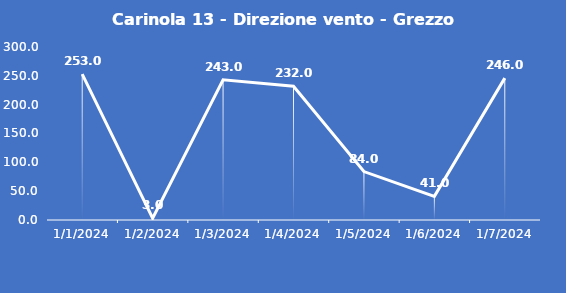
| Category | Carinola 13 - Direzione vento - Grezzo (°N) |
|---|---|
| 1/1/24 | 253 |
| 1/2/24 | 3 |
| 1/3/24 | 243 |
| 1/4/24 | 232 |
| 1/5/24 | 84 |
| 1/6/24 | 41 |
| 1/7/24 | 246 |